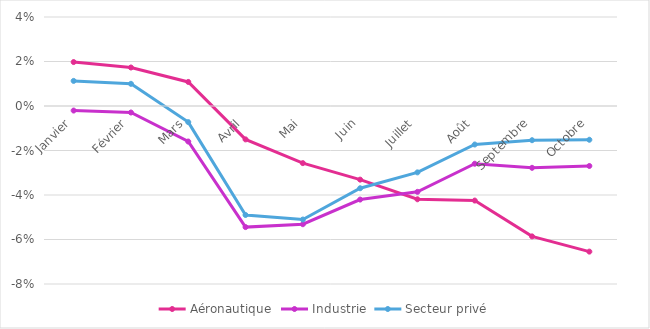
| Category | Aéronautique | Industrie | Secteur privé |
|---|---|---|---|
| Janvier | 0.02 | -0.002 | 0.011 |
| Février | 0.017 | -0.003 | 0.01 |
| Mars | 0.011 | -0.016 | -0.007 |
| Avril | -0.015 | -0.054 | -0.049 |
| Mai | -0.026 | -0.053 | -0.051 |
| Juin | -0.033 | -0.042 | -0.037 |
| Juillet | -0.042 | -0.039 | -0.03 |
| Août | -0.042 | -0.026 | -0.017 |
| Septembre | -0.059 | -0.028 | -0.015 |
| Octobre | -0.065 | -0.027 | -0.015 |